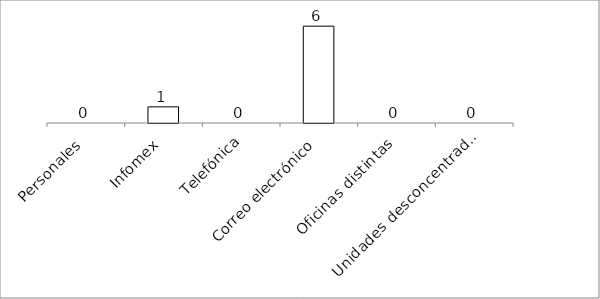
| Category | Series 0 |
|---|---|
| Personales | 0 |
| Infomex | 1 |
| Telefónica | 0 |
| Correo electrónico | 6 |
| Oficinas distintas | 0 |
| Unidades desconcentradas | 0 |